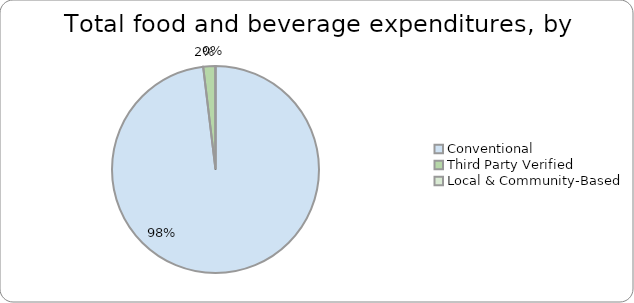
| Category | Series 0 |
|---|---|
| Conventional | 0.981 |
| Third Party Verified | 0.019 |
| Local & Community-Based | 0 |